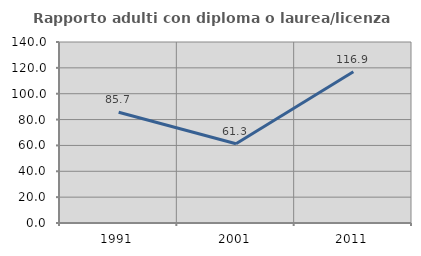
| Category | Rapporto adulti con diploma o laurea/licenza media  |
|---|---|
| 1991.0 | 85.714 |
| 2001.0 | 61.29 |
| 2011.0 | 116.949 |